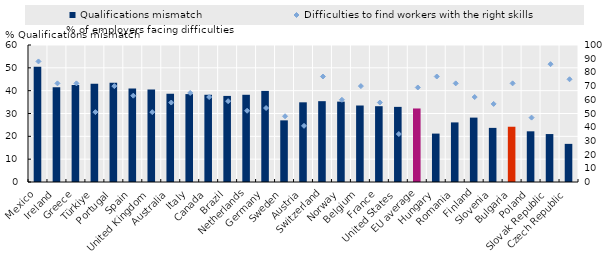
| Category | Qualifications mismatch |
|---|---|
| Mexico | 50.5 |
| Ireland | 41.5 |
| Greece | 42.5 |
| Türkiye | 43 |
| Portugal | 43.5 |
| Spain | 41 |
| United Kingdom | 40.5 |
| Australia | 38.7 |
| Italy | 38.5 |
| Canada | 38.2 |
| Brazil | 37.7 |
| Netherlands | 38.2 |
| Germany | 39.9 |
| Sweden | 27 |
| Austria | 34.9 |
| Switzerland | 35.4 |
| Norway | 35.2 |
| Belgium | 33.5 |
| France | 33.2 |
| United States | 32.9 |
| EU average | 32.2 |
| Hungary | 21.2 |
| Romania | 26.1 |
| Finland | 28.2 |
| Slovenia | 23.7 |
| Bulgaria | 24.2 |
| Poland | 22.2 |
| Slovak Republic | 21 |
| Czech Republic | 16.7 |